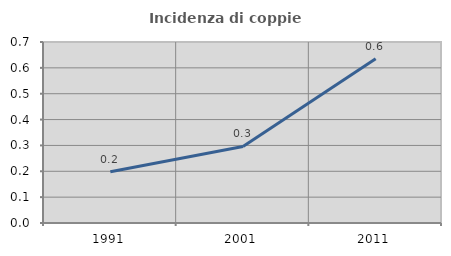
| Category | Incidenza di coppie miste |
|---|---|
| 1991.0 | 0.198 |
| 2001.0 | 0.296 |
| 2011.0 | 0.636 |